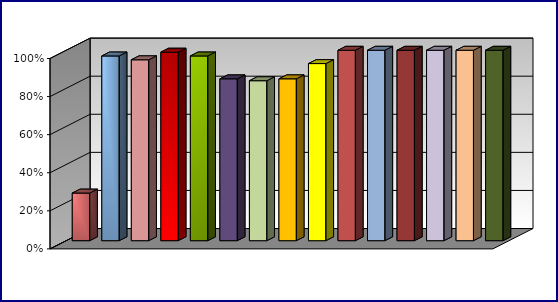
| Category | Series 0 | Series 1 | Series 2 | Series 3 |
|---|---|---|---|---|
| 0 | 0.25 |  |  |  |
| 1 | 0.97 |  |  |  |
| 2 | 0.95 |  |  |  |
| 3 | 0.99 |  |  |  |
| 4 | 0.97 |  |  |  |
| 5 | 0.85 |  |  |  |
| 6 | 0.84 |  |  |  |
| 7 | 0.85 |  |  |  |
| 8 | 0.93 |  |  |  |
| 9 | 1 |  |  |  |
| 10 | 1 |  |  |  |
| 11 | 1 |  |  |  |
| 12 | 1 |  |  |  |
| 13 | 1 |  |  |  |
| 14 | 1 |  |  |  |